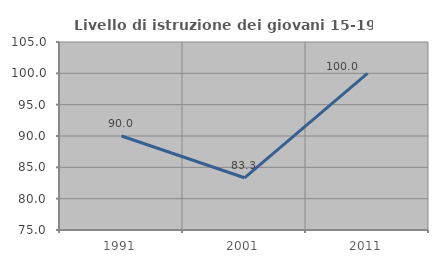
| Category | Livello di istruzione dei giovani 15-19 anni |
|---|---|
| 1991.0 | 90 |
| 2001.0 | 83.333 |
| 2011.0 | 100 |